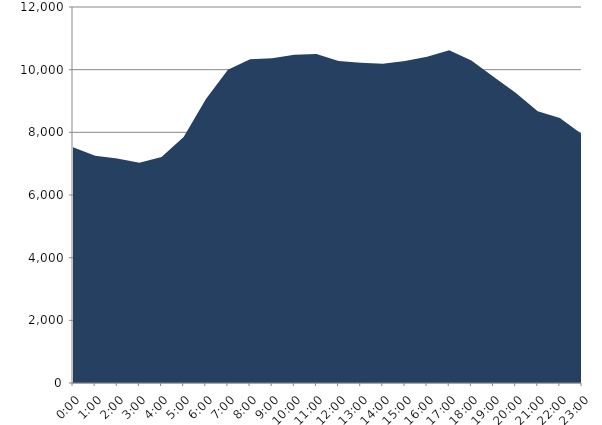
| Category | Series 0 | Series 1 |
|---|---|---|
| 2016-11-16 |  | 7527.397 |
| 2016-11-16 01:00:00 |  | 7255.947 |
| 2016-11-16 02:00:00 |  | 7168.338 |
| 2016-11-16 03:00:00 |  | 7026.892 |
| 2016-11-16 04:00:00 |  | 7211.918 |
| 2016-11-16 05:00:00 |  | 7851.684 |
| 2016-11-16 06:00:00 |  | 9054.962 |
| 2016-11-16 07:00:00 |  | 10000.841 |
| 2016-11-16 08:00:00 |  | 10331.606 |
| 2016-11-16 09:00:00 |  | 10360.95 |
| 2016-11-16 10:00:00 |  | 10476.144 |
| 2016-11-16 11:00:00 |  | 10501.679 |
| 2016-11-16 12:00:00 |  | 10278.057 |
| 2016-11-16 13:00:00 |  | 10221.546 |
| 2016-11-16 14:00:00 |  | 10185.78 |
| 2016-11-16 15:00:00 |  | 10278.511 |
| 2016-11-16 16:00:00 |  | 10414.396 |
| 2016-11-16 17:00:00 |  | 10619.281 |
| 2016-11-16 18:00:00 |  | 10289.714 |
| 2016-11-16 19:00:00 |  | 9774.984 |
| 2016-11-16 20:00:00 |  | 9264.886 |
| 2016-11-16 21:00:00 |  | 8671.94 |
| 2016-11-16 22:00:00 |  | 8458.317 |
| 2016-11-16 23:00:00 |  | 7938.59 |